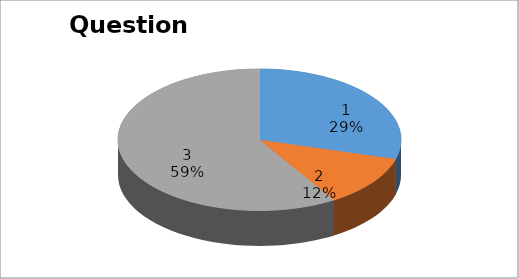
| Category | Series 0 |
|---|---|
| 0 | 5 |
| 1 | 2 |
| 2 | 10 |